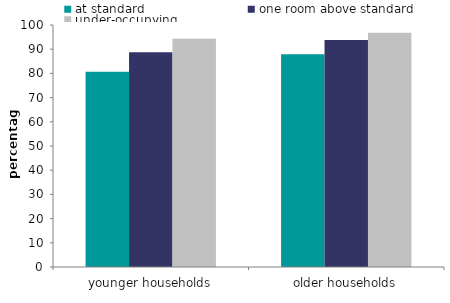
| Category | at standard | one room above standard | under-occupying |
|---|---|---|---|
| younger households | 80.719 | 88.787 | 94.319 |
| older households | 87.954 | 93.84 | 96.771 |